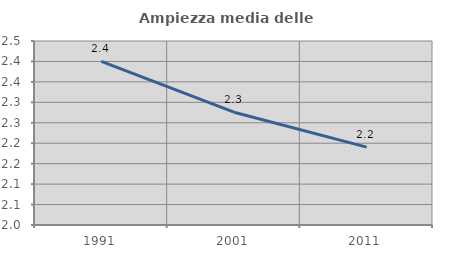
| Category | Ampiezza media delle famiglie |
|---|---|
| 1991.0 | 2.4 |
| 2001.0 | 2.276 |
| 2011.0 | 2.19 |